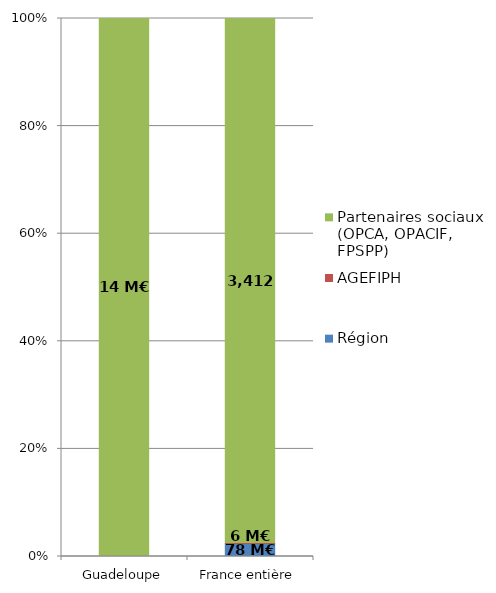
| Category | Région | AGEFIPH | Partenaires sociaux (OPCA, OPACIF, FPSPP) |
|---|---|---|---|
| Guadeloupe | 0 | 0 | 14.059 |
| France entière | 77.612 | 6.161 | 3411.683 |